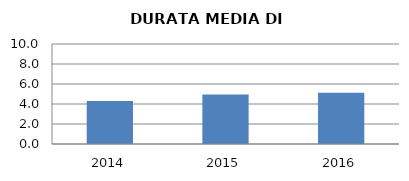
| Category | 2014 2015 2016 |
|---|---|
| 2014.0 | 4.293 |
| 2015.0 | 4.952 |
| 2016.0 | 5.125 |